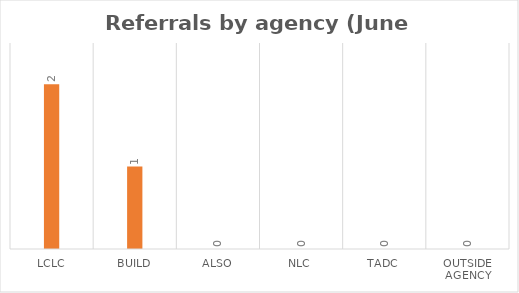
| Category | Series 0 |
|---|---|
| LCLC | 2 |
| BUILD | 1 |
| ALSO | 0 |
| NLC | 0 |
| TADC | 0 |
| Outside Agency | 0 |